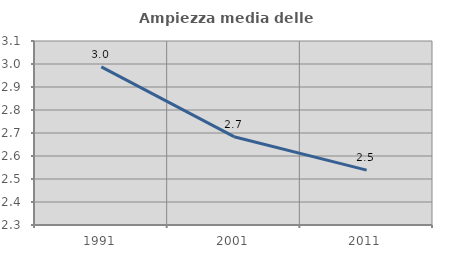
| Category | Ampiezza media delle famiglie |
|---|---|
| 1991.0 | 2.987 |
| 2001.0 | 2.684 |
| 2011.0 | 2.539 |